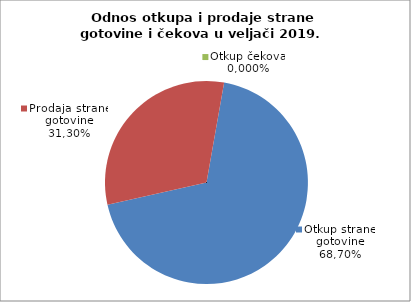
| Category | Otkup strane gotovine |
|---|---|
| 0 | 68.695 |
| 1 | 31.305 |
| 2 | 0 |